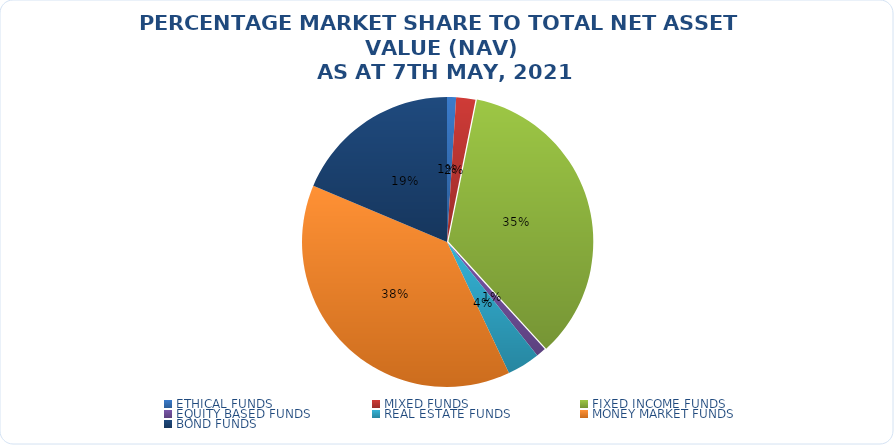
| Category | NET ASSET VALUE |
|---|---|
| ETHICAL FUNDS | 13646829854.68 |
| MIXED FUNDS | 29033055017.51 |
| FIXED INCOME FUNDS | 474844459808.276 |
| EQUITY BASED FUNDS | 14742884483.06 |
| REAL ESTATE FUNDS | 49697217654.141 |
| MONEY MARKET FUNDS | 519273063122.23 |
| BOND FUNDS | 252843228540.84 |